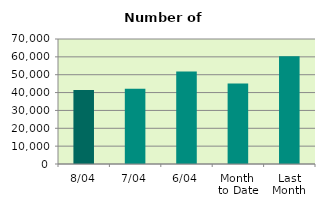
| Category | Series 0 |
|---|---|
| 8/04 | 41436 |
| 7/04 | 42180 |
| 6/04 | 51752 |
| Month 
to Date | 45136.333 |
| Last
Month | 60380.087 |